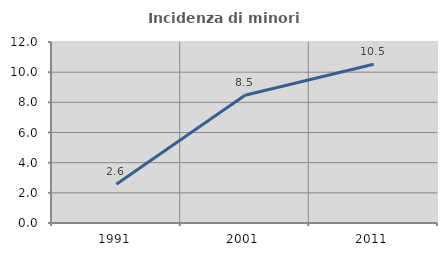
| Category | Incidenza di minori stranieri |
|---|---|
| 1991.0 | 2.564 |
| 2001.0 | 8.475 |
| 2011.0 | 10.526 |